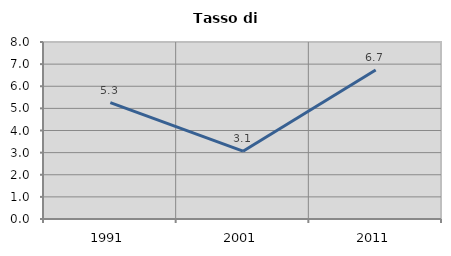
| Category | Tasso di disoccupazione   |
|---|---|
| 1991.0 | 5.263 |
| 2001.0 | 3.064 |
| 2011.0 | 6.738 |